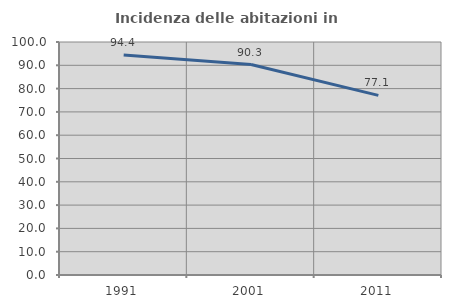
| Category | Incidenza delle abitazioni in proprietà  |
|---|---|
| 1991.0 | 94.375 |
| 2001.0 | 90.323 |
| 2011.0 | 77.099 |